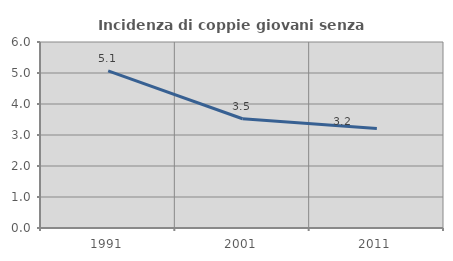
| Category | Incidenza di coppie giovani senza figli |
|---|---|
| 1991.0 | 5.068 |
| 2001.0 | 3.524 |
| 2011.0 | 3.208 |